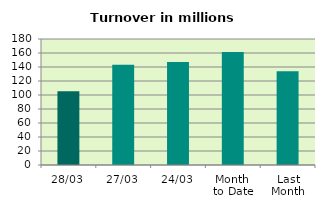
| Category | Series 0 |
|---|---|
| 28/03 | 105.517 |
| 27/03 | 143.072 |
| 24/03 | 147.015 |
| Month 
to Date | 161.387 |
| Last
Month | 133.846 |